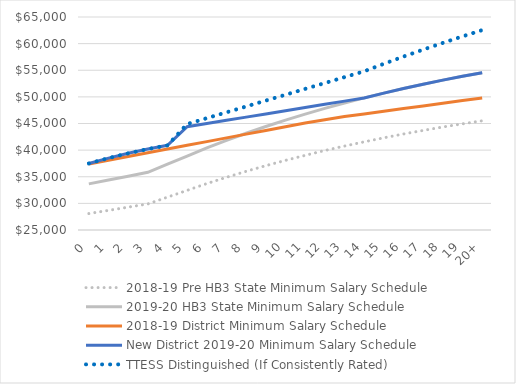
| Category | 2018-19 Pre HB3 State Minimum Salary Schedule | 2019-20 HB3 State Minimum Salary Schedule | 2018-19 District Minimum Salary Schedule | New District 2019-20 Minimum Salary Schedule | TTESS Distinguished (If Consistently Rated) |
|---|---|---|---|---|---|
| 0 | 28080 | 33660 | 37400 | 37500 | 37500 |
| 1 | 28690 | 34390 | 38100 | 38500 | 38500 |
| 2 | 29290 | 35100 | 38800 | 39400 | 39400 |
| 3 | 29890 | 35830 | 39500 | 40200 | 40200 |
| 4 | 31170 | 37350 | 40200 | 40900 | 40900 |
| 5 | 32440 | 38880 | 40900 | 44400 | 44900 |
| 6 | 33720 | 40410 | 41600 | 45000 | 46000 |
| 7 | 34900 | 41830 | 42300 | 45600 | 47100 |
| 8 | 36020 | 43170 | 43000 | 46200 | 48200 |
| 9 | 37080 | 44440 | 43700 | 46800 | 49300 |
| 10 | 38080 | 45630 | 44400 | 47400 | 50400 |
| 11 | 39020 | 46770 | 45100 | 48000 | 51500 |
| 12 | 39930 | 47850 | 45700 | 48600 | 52600 |
| 13 | 40760 | 48850 | 46300 | 49200 | 53700 |
| 14 | 41560 | 49810 | 46800 | 49800 | 54800 |
| 15 | 42310 | 50710 | 47300 | 50710 | 56210 |
| 16 | 43030 | 51570 | 47800 | 51570 | 57570 |
| 17 | 43700 | 52370 | 48300 | 52370 | 58870 |
| 18 | 44340 | 53140 | 48800 | 53140 | 60140 |
| 19 | 44940 | 53860 | 49300 | 53860 | 61360 |
| 20+ | 45510 | 54540 | 49800 | 54540 | 62540 |